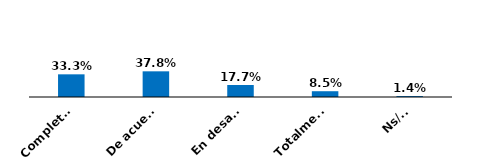
| Category | Series 0 |
|---|---|
| Completamente de acuerdo | 0.333 |
| De acuerdo | 0.378 |
| En desacuerdo | 0.177 |
| Totalmente en desacuerdo | 0.085 |
| Ns/Nr | 0.014 |